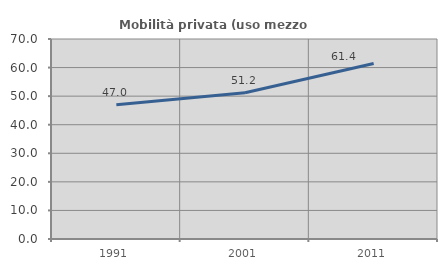
| Category | Mobilità privata (uso mezzo privato) |
|---|---|
| 1991.0 | 47.003 |
| 2001.0 | 51.204 |
| 2011.0 | 61.411 |